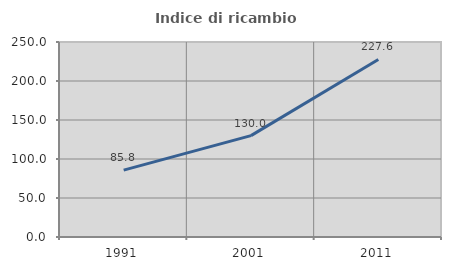
| Category | Indice di ricambio occupazionale  |
|---|---|
| 1991.0 | 85.759 |
| 2001.0 | 130 |
| 2011.0 | 227.604 |